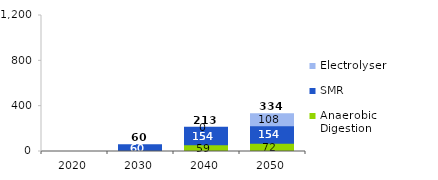
| Category | Anaerobic Digestion | SMR | Electrolyser | Series 4 |
|---|---|---|---|---|
| 2020.0 | 0 | 0 | 0 | 0 |
| 2030.0 | 0 | 59.73 | 0 | 59.73 |
| 2040.0 | 59.04 | 154.082 | 0 | 213.122 |
| 2050.0 | 72.36 | 154.082 | 107.523 | 333.966 |